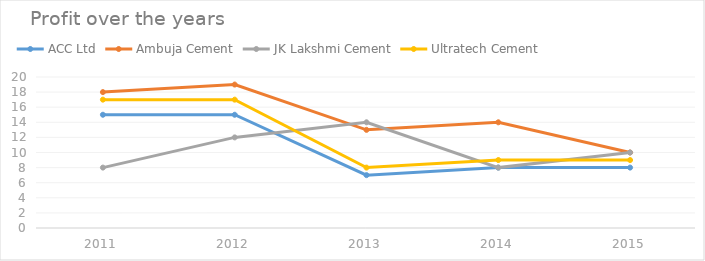
| Category | ACC Ltd | Ambuja Cement | JK Lakshmi Cement | Ultratech Cement |
|---|---|---|---|---|
| 2011 | 15 | 18 | 8 | 17 |
| 2012 | 15 | 19 | 12 | 17 |
| 2013 | 7 | 13 | 14 | 8 |
| 2014 | 8 | 14 | 8 | 9 |
| 2015 | 8 | 10 | 10 | 9 |